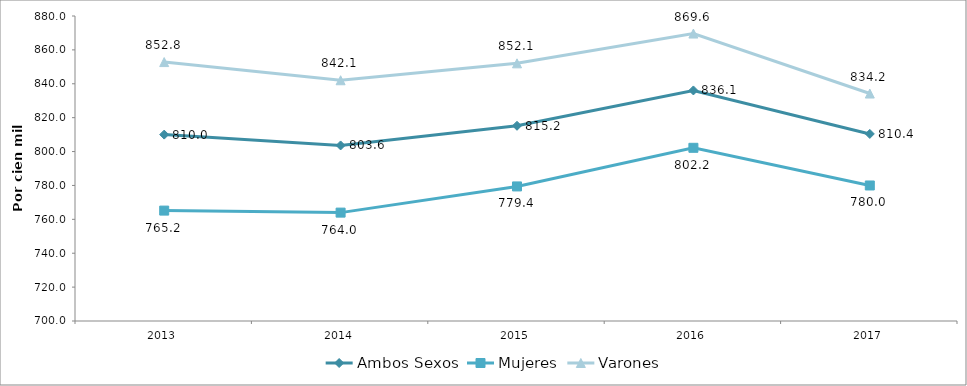
| Category | Ambos Sexos | Mujeres | Varones |
|---|---|---|---|
| 2013.0 | 810.008 | 765.157 | 852.813 |
| 2014.0 | 803.604 | 763.96 | 842.074 |
| 2015.0 | 815.219 | 779.418 | 852.061 |
| 2016.0 | 836.066 | 802.213 | 869.639 |
| 2017.0 | 810.4 | 779.977 | 834.243 |